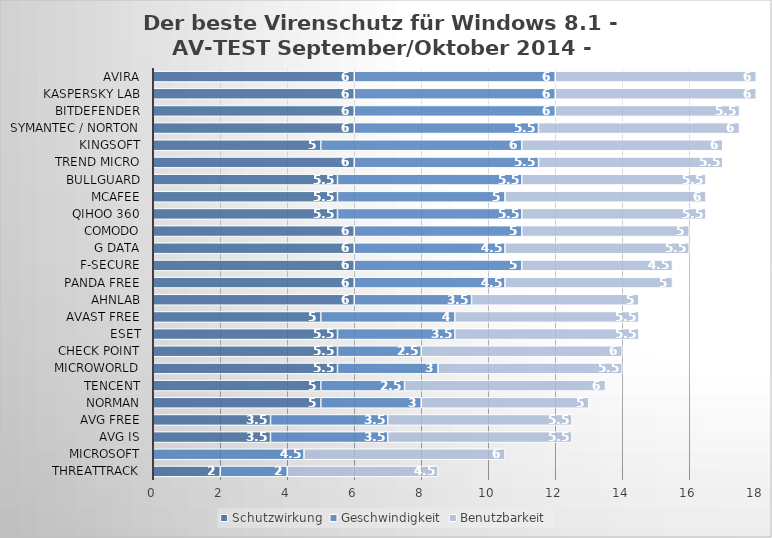
| Category | Schutzwirkung | Geschwindigkeit | Benutzbarkeit |
|---|---|---|---|
| ThreatTrack | 2 | 2 | 4.5 |
| Microsoft | 0 | 4.5 | 6 |
| AVG IS | 3.5 | 3.5 | 5.5 |
| AVG Free | 3.5 | 3.5 | 5.5 |
| Norman | 5 | 3 | 5 |
| Tencent | 5 | 2.5 | 6 |
| Microworld | 5.5 | 3 | 5.5 |
| Check Point | 5.5 | 2.5 | 6 |
| ESET | 5.5 | 3.5 | 5.5 |
| Avast Free | 5 | 4 | 5.5 |
| AhnLab | 6 | 3.5 | 5 |
| Panda Free | 6 | 4.5 | 5 |
| F-Secure | 6 | 5 | 4.5 |
| G Data | 6 | 4.5 | 5.5 |
| Comodo | 6 | 5 | 5 |
| Qihoo 360 | 5.5 | 5.5 | 5.5 |
| McAfee | 5.5 | 5 | 6 |
| BullGuard | 5.5 | 5.5 | 5.5 |
| Trend Micro | 6 | 5.5 | 5.5 |
| Kingsoft | 5 | 6 | 6 |
| Symantec / Norton | 6 | 5.5 | 6 |
| Bitdefender | 6 | 6 | 5.5 |
| Kaspersky Lab | 6 | 6 | 6 |
| Avira | 6 | 6 | 6 |